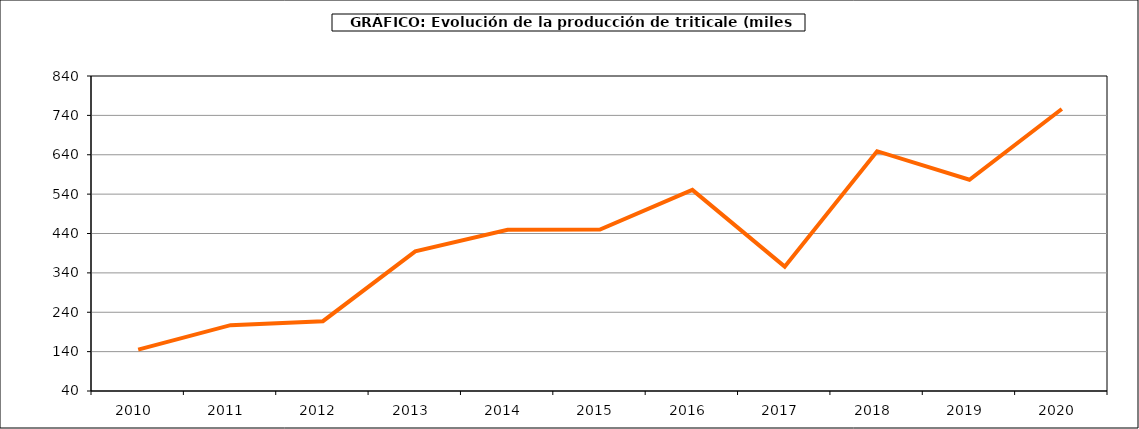
| Category | Producción |
|---|---|
| 2010.0 | 144.991 |
| 2011.0 | 207.218 |
| 2012.0 | 217.311 |
| 2013.0 | 394.752 |
| 2014.0 | 449.675 |
| 2015.0 | 449.983 |
| 2016.0 | 550.838 |
| 2017.0 | 355.84 |
| 2018.0 | 649.011 |
| 2019.0 | 576.505 |
| 2020.0 | 756.194 |